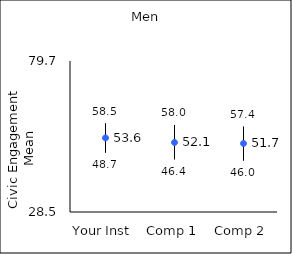
| Category | 25th percentile | 75th percentile | Mean |
|---|---|---|---|
| Your Inst | 48.7 | 58.5 | 53.62 |
| Comp 1 | 46.4 | 58 | 52.07 |
| Comp 2 | 46 | 57.4 | 51.73 |